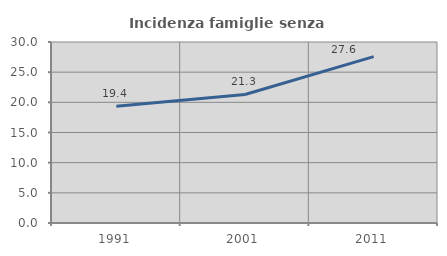
| Category | Incidenza famiglie senza nuclei |
|---|---|
| 1991.0 | 19.361 |
| 2001.0 | 21.308 |
| 2011.0 | 27.57 |